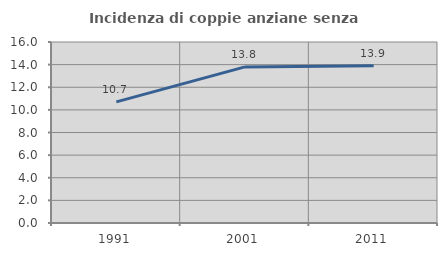
| Category | Incidenza di coppie anziane senza figli  |
|---|---|
| 1991.0 | 10.71 |
| 2001.0 | 13.798 |
| 2011.0 | 13.907 |